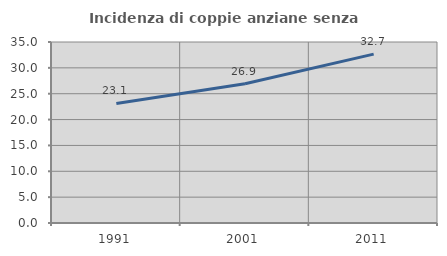
| Category | Incidenza di coppie anziane senza figli  |
|---|---|
| 1991.0 | 23.127 |
| 2001.0 | 26.916 |
| 2011.0 | 32.662 |